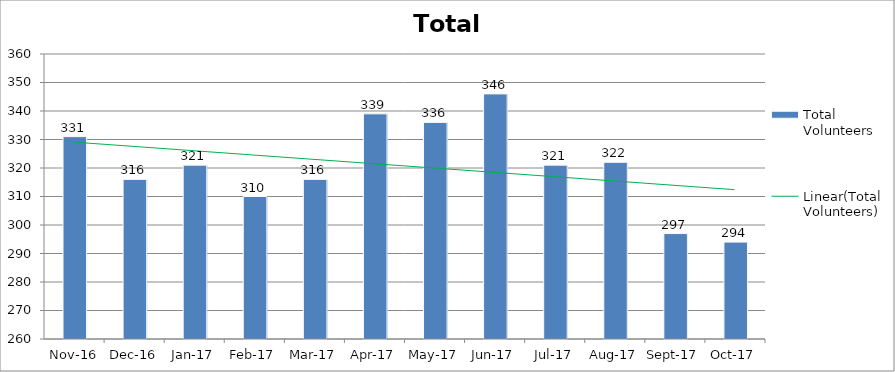
| Category | Total Volunteers |
|---|---|
| 2016-11-01 | 331 |
| 2016-12-01 | 316 |
| 2017-01-01 | 321 |
| 2017-02-01 | 310 |
| 2017-03-01 | 316 |
| 2017-04-01 | 339 |
| 2017-05-01 | 336 |
| 2017-06-01 | 346 |
| 2017-07-01 | 321 |
| 2017-08-01 | 322 |
| 2017-09-01 | 297 |
| 2017-10-01 | 294 |